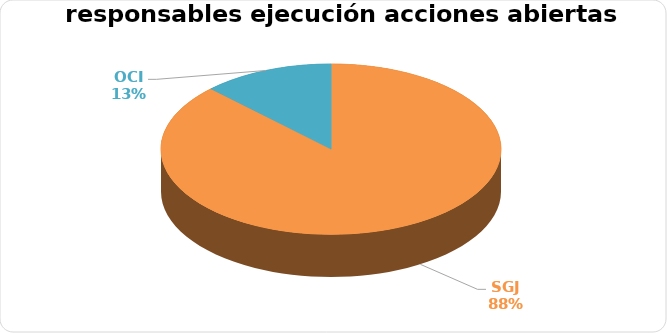
| Category | Series 0 |
|---|---|
| SGJ | 7 |
| OCI | 1 |